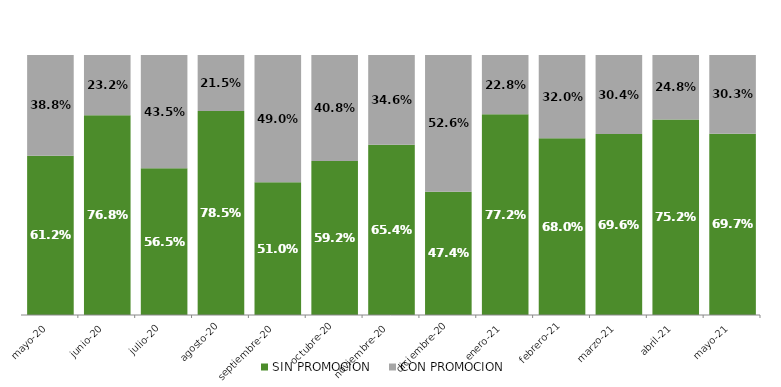
| Category | SIN PROMOCION   | CON PROMOCION   |
|---|---|---|
| 2020-05-01 | 0.612 | 0.388 |
| 2020-06-01 | 0.768 | 0.232 |
| 2020-07-01 | 0.565 | 0.435 |
| 2020-08-01 | 0.785 | 0.215 |
| 2020-09-01 | 0.51 | 0.49 |
| 2020-10-01 | 0.592 | 0.408 |
| 2020-11-01 | 0.654 | 0.346 |
| 2020-12-01 | 0.474 | 0.526 |
| 2021-01-01 | 0.772 | 0.228 |
| 2021-02-01 | 0.68 | 0.32 |
| 2021-03-01 | 0.696 | 0.304 |
| 2021-04-01 | 0.752 | 0.248 |
| 2021-05-01 | 0.697 | 0.303 |